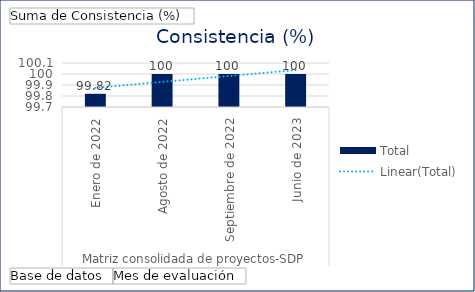
| Category | Total |
|---|---|
| 0 | 99.82 |
| 1 | 100 |
| 2 | 100 |
| 3 | 100 |